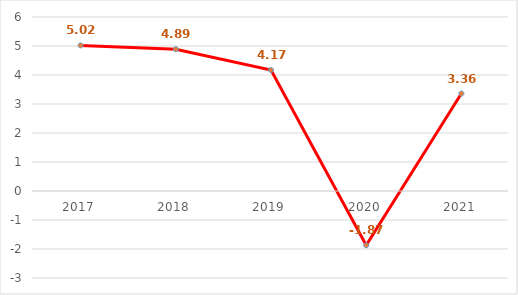
| Category | Produk Domestik Regional Bruto |
|---|---|
| 2017.0 | 5.02 |
| 2018.0 | 4.89 |
| 2019.0 | 4.17 |
| 2020.0 | -1.87 |
| 2021.0 | 3.36 |